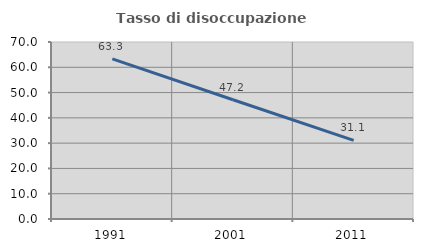
| Category | Tasso di disoccupazione giovanile  |
|---|---|
| 1991.0 | 63.34 |
| 2001.0 | 47.17 |
| 2011.0 | 31.102 |